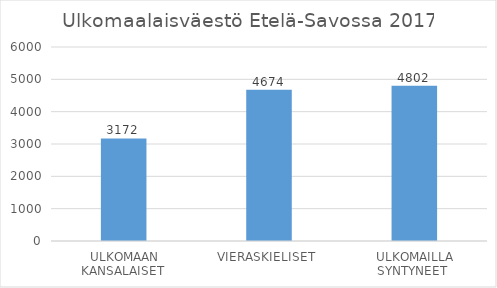
| Category | Etelä-Savo |
|---|---|
| ULKOMAAN KANSALAISET  | 3172 |
| VIERASKIELISET  | 4674 |
| ULKOMAILLA SYNTYNEET  | 4802 |